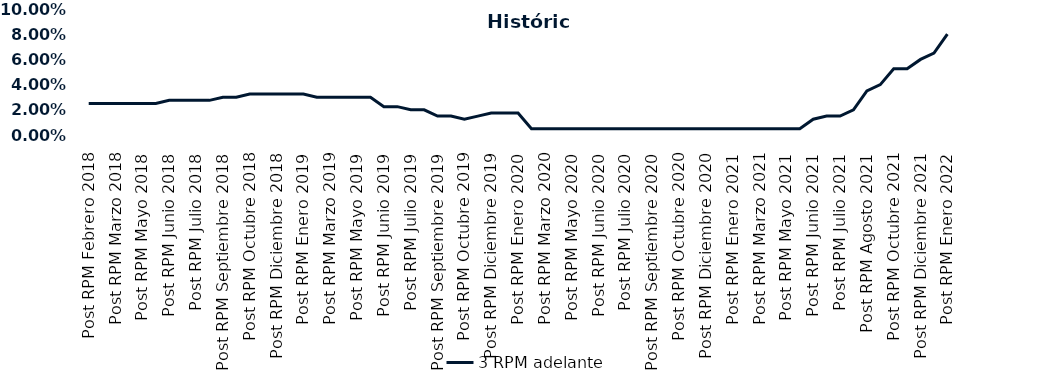
| Category | 3 RPM adelante |
|---|---|
| Post RPM Febrero 2018 | 0.025 |
| Pre RPM Marzo 2018 | 0.025 |
| Post RPM Marzo 2018 | 0.025 |
| Pre RPM Mayo 2018 | 0.025 |
| Post RPM Mayo 2018 | 0.025 |
| Pre RPM Junio 2018 | 0.025 |
| Post RPM Junio 2018 | 0.028 |
| Pre RPM Julio 2018 | 0.028 |
| Post RPM Julio 2018 | 0.028 |
| Pre RPM Septiembre 2018 | 0.028 |
| Post RPM Septiembre 2018 | 0.03 |
| Pre RPM Octubre 2018 | 0.03 |
| Post RPM Octubre 2018 | 0.032 |
| Pre RPM Diciembre 2018 | 0.032 |
| Post RPM Diciembre 2018 | 0.032 |
| Pre RPM Enero 2019 | 0.032 |
| Post RPM Enero 2019 | 0.032 |
| Pre RPM Marzo 2019 | 0.03 |
| Post RPM Marzo 2019 | 0.03 |
| Pre RPM Mayo 2019 | 0.03 |
| Post RPM Mayo 2019 | 0.03 |
| Pre RPM Junio 2019 | 0.03 |
| Post RPM Junio 2019 | 0.022 |
| Pre RPM Julio 2019 | 0.022 |
| Post RPM Julio 2019 | 0.02 |
| Pre RPM Septiembre 2019 | 0.02 |
| Post RPM Septiembre 2019 | 0.015 |
| Pre RPM Octubre 2019 | 0.015 |
| Post RPM Octubre 2019 | 0.012 |
| Pre RPM Diciembre 2019 | 0.015 |
| Post RPM Diciembre 2019 | 0.018 |
| Pre RPM Enero 2020 | 0.018 |
| Post RPM Enero 2020 | 0.018 |
| Pre RPM Marzo 2020 | 0.005 |
| Post RPM Marzo 2020 | 0.005 |
| Pre RPM Mayo 2020 | 0.005 |
| Post RPM Mayo 2020 | 0.005 |
| Pre RPM Junio 2020 | 0.005 |
| Post RPM Junio 2020 | 0.005 |
| Pre RPM Julio 2020 | 0.005 |
| Post RPM Julio 2020 | 0.005 |
| Pre RPM Septiembre 2020 | 0.005 |
| Post RPM Septiembre 2020 | 0.005 |
| Pre RPM Octubre 2020 | 0.005 |
| Post RPM Octubre 2020 | 0.005 |
| Pre RPM Diciembre 2020 | 0.005 |
| Post RPM Diciembre 2020 | 0.005 |
| Pre RPM Enero 2021 | 0.005 |
| Post RPM Enero 2021 | 0.005 |
| Pre RPM Marzo 2021 | 0.005 |
| Post RPM Marzo 2021 | 0.005 |
| Pre RPM Mayo 2021 | 0.005 |
| Post RPM Mayo 2021 | 0.005 |
| Pre RPM Junio 2021 | 0.005 |
| Post RPM Junio 2021 | 0.012 |
| Pre RPM Julio 2021 | 0.015 |
| Post RPM Julio 2021 | 0.015 |
| Pre RPM Agosto 2021 | 0.02 |
| Post RPM Agosto 2021 | 0.035 |
| Pre RPM Octubre 2021 | 0.04 |
| Post RPM Octubre 2021 | 0.052 |
| Pre RPM Diciembre 2021 | 0.052 |
| Post RPM Diciembre 2021 | 0.06 |
| Pre RPM Enero 2022 | 0.065 |
| Post RPM Enero 2022 | 0.08 |